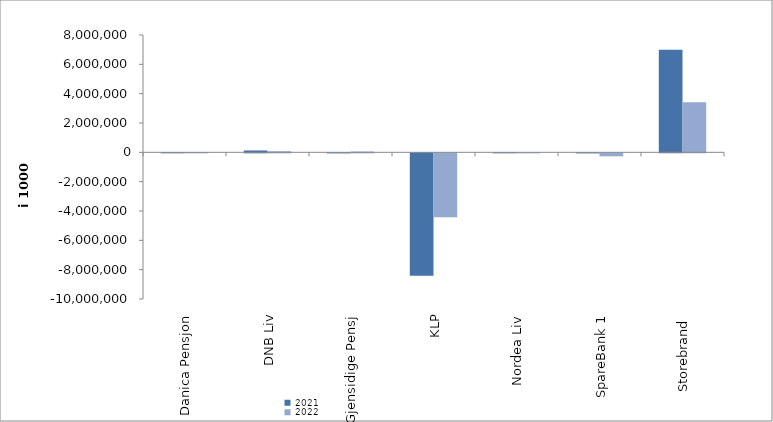
| Category | 2021 | 2022 |
|---|---|---|
| Danica Pensjon | 3625.74 | 5339.348 |
| DNB Liv | 128120 | 76914 |
| Gjensidige Pensj | -5822 | 57086 |
| KLP | -8346122.359 | -4355080.076 |
| Nordea Liv | 137.296 | -1840.417 |
| SpareBank 1 | -4778.64 | -204444.928 |
| Storebrand  | 6995598.233 | 3416282.855 |